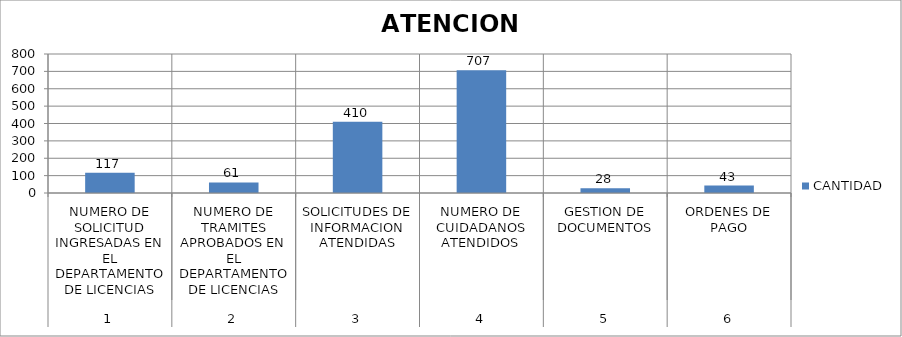
| Category | CANTIDAD |
|---|---|
| 0 | 117 |
| 1 | 61 |
| 2 | 410 |
| 3 | 707 |
| 4 | 28 |
| 5 | 43 |